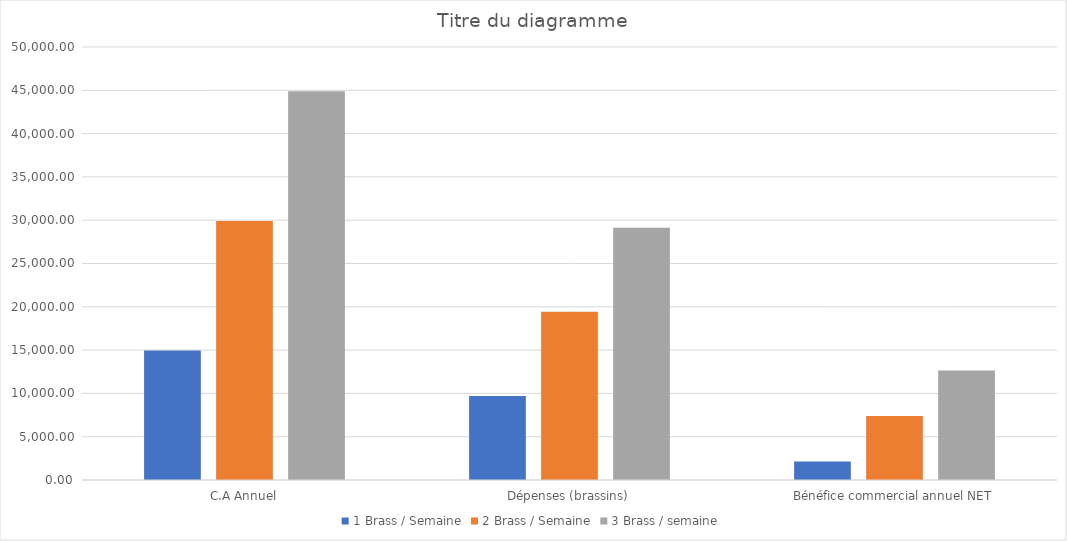
| Category | 1 Brass / Semaine | 2 Brass / Semaine | 3 Brass / semaine |
|---|---|---|---|
| C.A Annuel | 14960 | 29920 | 44880 |
| Dépenses (brassins) | 9713.317 | 19426.635 | 29139.952 |
| Bénéfice commercial annuel NET | 2143.483 | 7390.165 | 12636.848 |